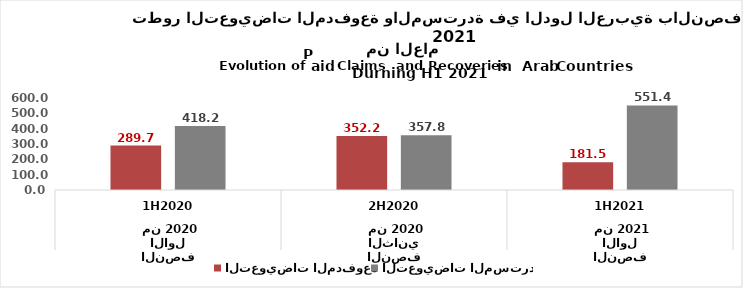
| Category | التعويضات المدفوعة | التعويضات المستردة |
|---|---|---|
| 0 | 289.738 | 418.154 |
| 1 | 352.188 | 357.824 |
| 2 | 181.467 | 551.373 |